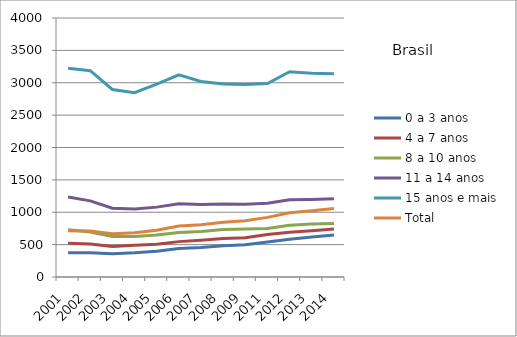
| Category | 0 a 3 anos | 4 a 7 anos | 8 a 10 anos | 11 a 14 anos | 15 anos e mais | Total |
|---|---|---|---|---|---|---|
| 2001.0 | 373.4 | 519.9 | 728.7 | 1235.1 | 3222.7 | 713 |
| 2002.0 | 373.4 | 507.9 | 695.3 | 1176 | 3186.4 | 711.1 |
| 2003.0 | 359.5 | 472 | 624.7 | 1061.8 | 2895.9 | 668.8 |
| 2004.0 | 373.7 | 489.5 | 626.4 | 1048.9 | 2847.2 | 682.3 |
| 2005.0 | 396.5 | 506.6 | 650.2 | 1079.1 | 2980.3 | 722.9 |
| 2006.0 | 438.4 | 546.4 | 687.3 | 1132.2 | 3121 | 788.4 |
| 2007.0 | 454.4 | 569.2 | 702 | 1119.5 | 3020.3 | 807.5 |
| 2008.0 | 484.3 | 593.9 | 731.7 | 1128.2 | 2980 | 846 |
| 2009.0 | 498.7 | 608 | 740.5 | 1123.1 | 2973.5 | 868.7 |
| 2011.0 | 540.6 | 658 | 750.8 | 1139.7 | 2988.7 | 920.7 |
| 2012.0 | 582.2 | 692.5 | 800.6 | 1193.1 | 3169.4 | 991.2 |
| 2013.0 | 618.5 | 715.3 | 820.1 | 1198.8 | 3145.4 | 1024.4 |
| 2014.0 | 646.9 | 742.1 | 824.8 | 1210.2 | 3137.4 | 1057.3 |